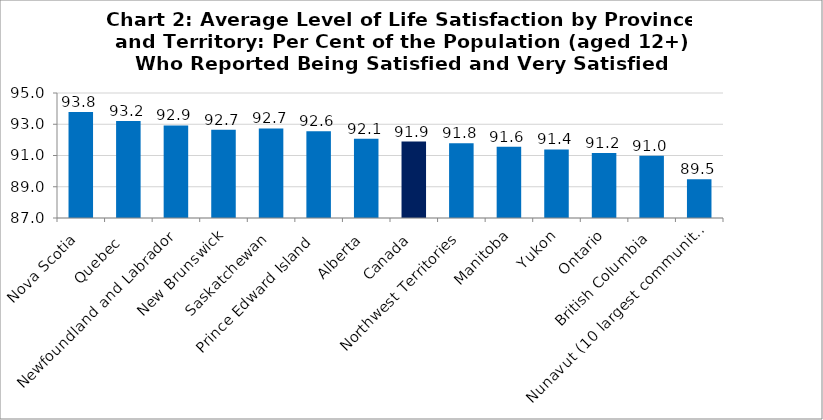
| Category | Series 0 | Series 1 | Series 2 | Series 3 | Series 4 | Series 5 | Series 6 | Series 7 | Series 8 | Series 9 |
|---|---|---|---|---|---|---|---|---|---|---|
| Nova Scotia |  |  |  |  |  |  |  |  |  | 93.789 |
| Quebec  |  |  |  |  |  |  |  |  |  | 93.211 |
| Newfoundland and Labrador |  |  |  |  |  |  |  |  |  | 92.922 |
| New Brunswick |  |  |  |  |  |  |  |  |  | 92.656 |
| Saskatchewan |  |  |  |  |  |  |  |  |  | 92.733 |
| Prince Edward Island  |  |  |  |  |  |  |  |  |  | 92.556 |
| Alberta |  |  |  |  |  |  |  |  |  | 92.067 |
| Canada |  |  |  |  |  |  |  |  |  | 91.889 |
| Northwest Territories |  |  |  |  |  |  |  |  |  | 91.789 |
| Manitoba |  |  |  |  |  |  |  |  |  | 91.567 |
| Yukon |  |  |  |  |  |  |  |  |  | 91.389 |
| Ontario |  |  |  |  |  |  |  |  |  | 91.156 |
| British Columbia |  |  |  |  |  |  |  |  |  | 90.978 |
| Nunavut (10 largest communities) |  |  |  |  |  |  |  |  |  | 89.478 |